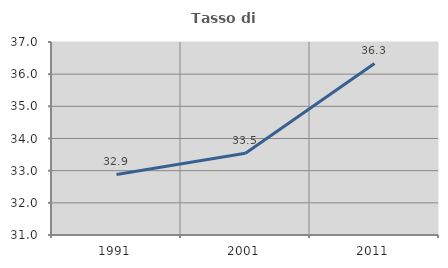
| Category | Tasso di occupazione   |
|---|---|
| 1991.0 | 32.884 |
| 2001.0 | 33.538 |
| 2011.0 | 36.332 |